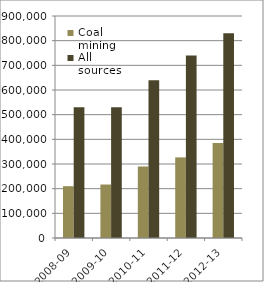
| Category | Coal mining | All sources |
|---|---|---|
| _x0007_2008-09 | 210000 | 530000 |
| _x0007_2009-10 | 216810.138 | 530000 |
| _x0007_2010-11 | 289907.919 | 640000 |
| _x0007_2011-12 | 326837.137 | 740000 |
| _x0007_2012-13 | 384874.768 | 830000 |